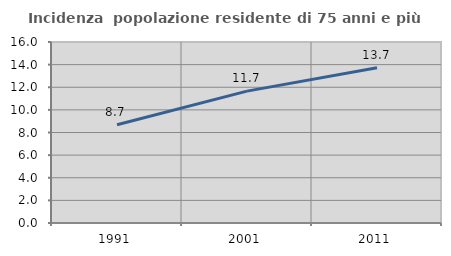
| Category | Incidenza  popolazione residente di 75 anni e più |
|---|---|
| 1991.0 | 8.69 |
| 2001.0 | 11.658 |
| 2011.0 | 13.731 |